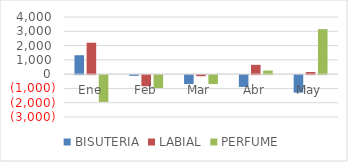
| Category | BISUTERIA | LABIAL | PERFUME |
|---|---|---|---|
| Ene | 1325 | 2200 | -1875 |
| Feb | -50 | -775 | -900 |
| Mar | -625 | -75 | -625 |
| Abr | -825 | 650 | 250 |
| May | -1225 | 150 | 3150 |